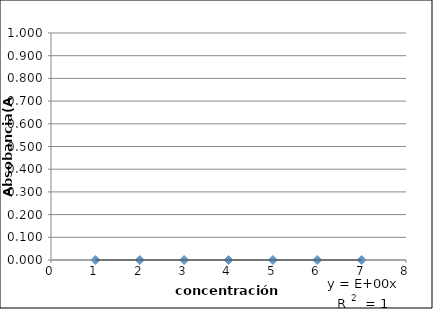
| Category | Absorbancia (A) |
|---|---|
| 0 | 0 |
| 1 | 0 |
| 2 | 0 |
| 3 | 0 |
| 4 | 0 |
| 5 | 0 |
| 6 | 0 |